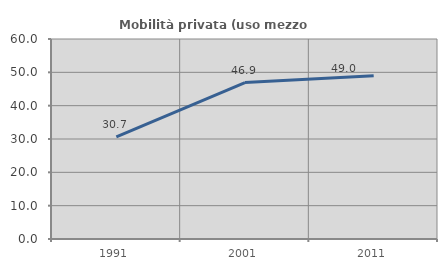
| Category | Mobilità privata (uso mezzo privato) |
|---|---|
| 1991.0 | 30.654 |
| 2001.0 | 46.937 |
| 2011.0 | 48.984 |